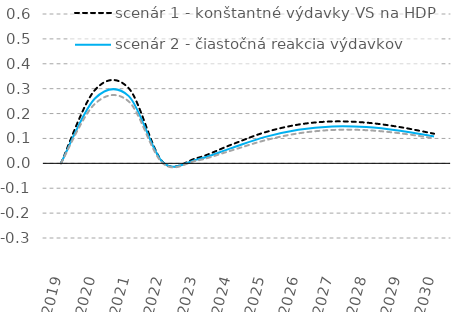
| Category | scenár 1 - konštantné výdavky VS na HDP | scenár 2 - čiastočná reakcia výdavkov | scenár 3 - bez dodatočného rastu výdavkov VS |
|---|---|---|---|
| 2019.0 | 0 | 0 | 0 |
| 2020.0 | 0.294 | 0.26 | 0.239 |
| 2021.0 | 0.301 | 0.27 | 0.248 |
| 2022.0 | 0.005 | 0.004 | 0.001 |
| 2023.0 | 0.021 | 0.015 | 0.011 |
| 2024.0 | 0.074 | 0.06 | 0.051 |
| 2025.0 | 0.124 | 0.105 | 0.092 |
| 2026.0 | 0.156 | 0.135 | 0.12 |
| 2027.0 | 0.168 | 0.148 | 0.134 |
| 2028.0 | 0.164 | 0.146 | 0.133 |
| 2029.0 | 0.146 | 0.131 | 0.121 |
| 2030.0 | 0.119 | 0.108 | 0.101 |